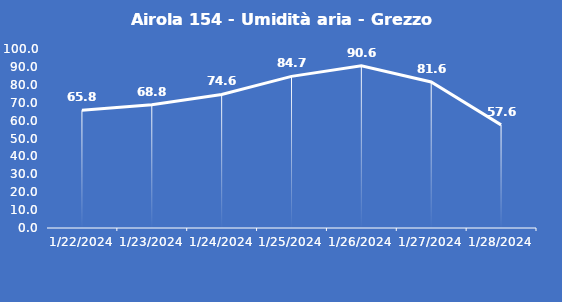
| Category | Airola 154 - Umidità aria - Grezzo (%) |
|---|---|
| 1/22/24 | 65.8 |
| 1/23/24 | 68.8 |
| 1/24/24 | 74.6 |
| 1/25/24 | 84.7 |
| 1/26/24 | 90.6 |
| 1/27/24 | 81.6 |
| 1/28/24 | 57.6 |